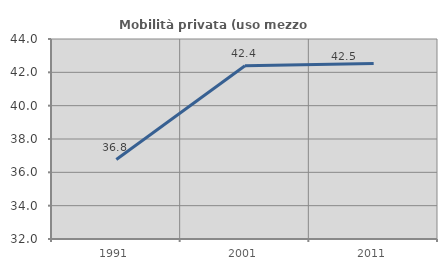
| Category | Mobilità privata (uso mezzo privato) |
|---|---|
| 1991.0 | 36.767 |
| 2001.0 | 42.399 |
| 2011.0 | 42.532 |